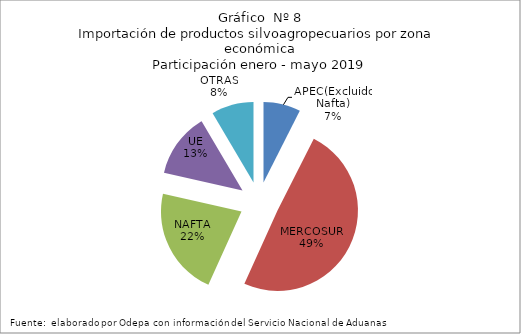
| Category | Series 0 |
|---|---|
| APEC(Excluido Nafta) | 196048.98 |
| MERCOSUR | 1298213.019 |
| NAFTA | 574019.067 |
| UE | 341497.621 |
| OTRAS | 223278.313 |